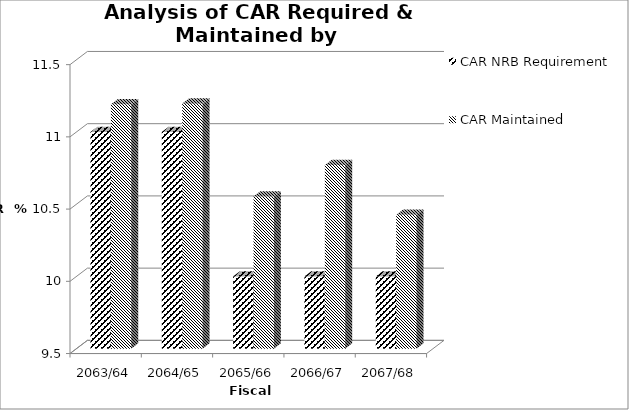
| Category | CAR NRB Requirement | CAR Maintained |
|---|---|---|
| 2063/64 | 11 | 11.191 |
| 2064/65 | 11 | 11.196 |
| 2065/66 | 10 | 10.554 |
| 2066/67 | 10 | 10.771 |
| 2067/68 | 10 | 10.426 |